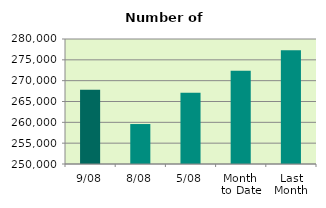
| Category | Series 0 |
|---|---|
| 9/08 | 267846 |
| 8/08 | 259592 |
| 5/08 | 267086 |
| Month 
to Date | 272389.143 |
| Last
Month | 277312.476 |